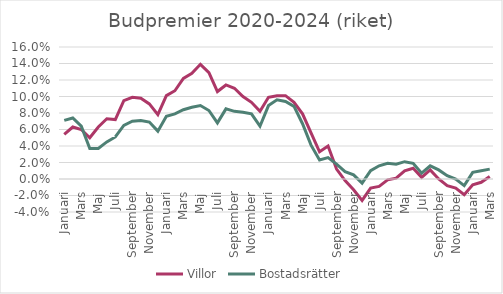
| Category | Villor | Bostadsrätter |
|---|---|---|
| Januari | 0.054 | 0.071 |
| Februari | 0.063 | 0.074 |
| Mars | 0.06 | 0.064 |
| April | 0.05 | 0.037 |
| Maj | 0.063 | 0.037 |
| Juni | 0.073 | 0.045 |
| Juli | 0.072 | 0.051 |
| Augusti | 0.095 | 0.065 |
| September | 0.099 | 0.07 |
| Oktober | 0.098 | 0.071 |
| November | 0.091 | 0.069 |
| December | 0.078 | 0.058 |
| Januari | 0.101 | 0.076 |
| Februari | 0.107 | 0.079 |
| Mars | 0.122 | 0.084 |
| April | 0.128 | 0.087 |
| Maj | 0.139 | 0.089 |
| Juni | 0.129 | 0.083 |
| Juli | 0.106 | 0.068 |
| Augusti | 0.114 | 0.085 |
| September | 0.11 | 0.082 |
| Oktober | 0.1 | 0.081 |
| November | 0.093 | 0.079 |
| December | 0.082 | 0.064 |
| Januari | 0.099 | 0.089 |
| Februari | 0.101 | 0.096 |
| Mars | 0.101 | 0.094 |
| April | 0.093 | 0.088 |
| Maj | 0.079 | 0.067 |
| Juni | 0.056 | 0.041 |
| Juli | 0.033 | 0.023 |
| Augusti | 0.04 | 0.026 |
| September | 0.012 | 0.018 |
| Oktober | -0.002 | 0.009 |
| November | -0.013 | 0.005 |
| December | -0.026 | -0.005 |
| Januari | -0.011 | 0.01 |
| Februari | -0.009 | 0.016 |
| Mars | -0.001 | 0.019 |
| April | 0.001 | 0.018 |
| Maj | 0.01 | 0.021 |
| Juni | 0.013 | 0.019 |
| Juli | 0.002 | 0.007 |
| Augusti | 0.011 | 0.016 |
| September | 0 | 0.011 |
| Oktober | -0.008 | 0.004 |
| November | -0.011 | 0 |
| December | -0.019 | -0.008 |
| Januari | -0.007 | 0.008 |
| Februari | -0.004 | 0.01 |
| Mars | 0.003 | 0.012 |